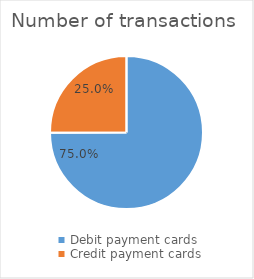
| Category | Number of transactions  |
|---|---|
| Debit payment cards | 264734955 |
| Credit payment cards | 88422118 |